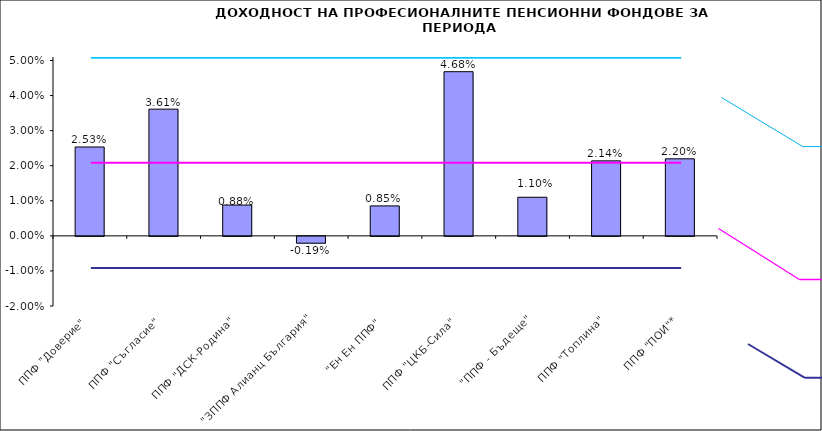
| Category | Series 0 |
|---|---|
| ППФ "Доверие"  | 0.025 |
| ППФ "Съгласие"  | 0.036 |
| ППФ "ДСК-Родина"  | 0.009 |
| "ЗППФ Алианц България"  | -0.002 |
| "Ен Ен ППФ"  | 0.009 |
| ППФ "ЦКБ-Сила"  | 0.047 |
| "ППФ - Бъдеще" | 0.011 |
| ППФ "Топлина" | 0.021 |
| ППФ "ПОИ"* | 0.022 |